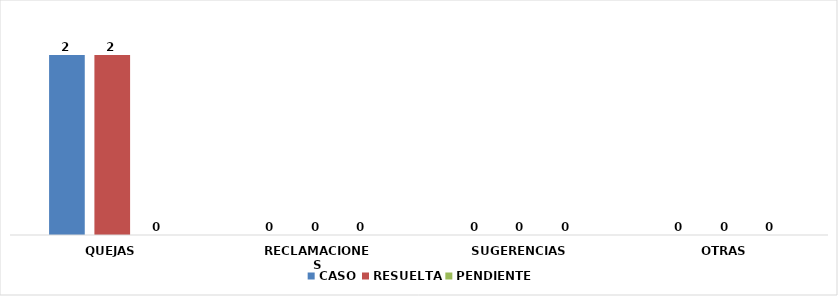
| Category | CASO | RESUELTA | PENDIENTE |
|---|---|---|---|
| QUEJAS | 2 | 2 | 0 |
| RECLAMACIONES | 0 | 0 | 0 |
| SUGERENCIAS | 0 | 0 | 0 |
| OTRAS | 0 | 0 | 0 |